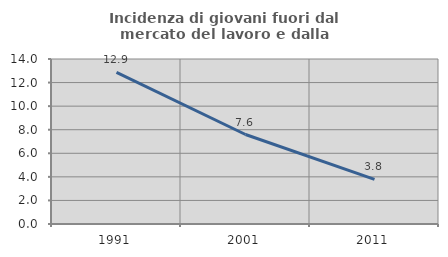
| Category | Incidenza di giovani fuori dal mercato del lavoro e dalla formazione  |
|---|---|
| 1991.0 | 12.861 |
| 2001.0 | 7.593 |
| 2011.0 | 3.787 |